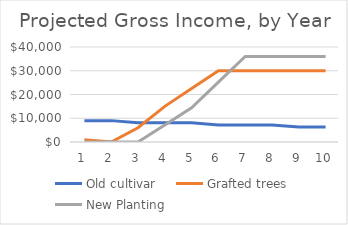
| Category | Old cultivar | Grafted trees | New Planting |
|---|---|---|---|
| 0 | 9000 | 1000 | 0 |
| 1 | 9000 | 0 | 0 |
| 2 | 8100 | 6000 | 0 |
| 3 | 8100 | 15000 | 7200 |
| 4 | 8100 | 22500 | 14400 |
| 5 | 7200 | 30000 | 25200 |
| 6 | 7200 | 30000 | 36000 |
| 7 | 7200 | 30000 | 36000 |
| 8 | 6300 | 30000 | 36000 |
| 9 | 6300 | 30000 | 36000 |